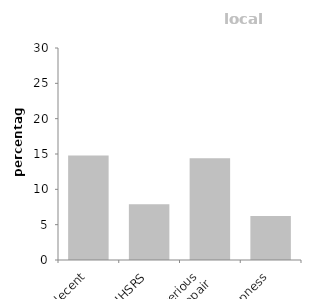
| Category | local authority |
|---|---|
| non decent | 14.786 |
| HHSRS | 7.873 |
| serious 
disrepair | 14.394 |
| dampness | 6.217 |